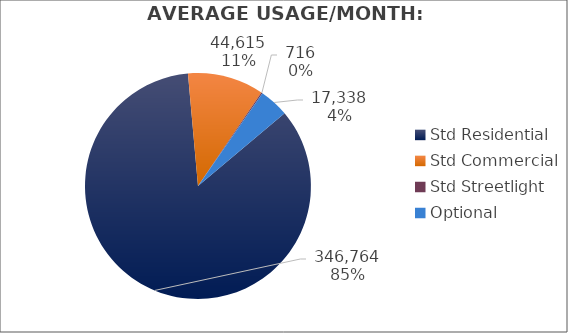
| Category | Usage |
|---|---|
| Std Residential | 346764 |
| Std Commercial | 44614.667 |
| Std Streetlight | 716 |
| Optional | 17338 |